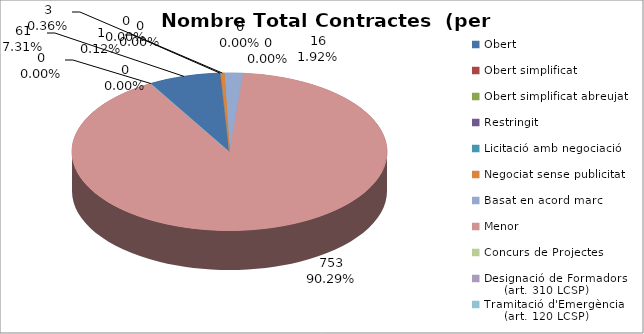
| Category | Nombre Total Contractes |
|---|---|
| Obert | 61 |
| Obert simplificat | 1 |
| Obert simplificat abreujat | 0 |
| Restringit | 0 |
| Licitació amb negociació | 0 |
| Negociat sense publicitat | 3 |
| Basat en acord marc | 16 |
| Menor | 753 |
| Concurs de Projectes | 0 |
| Designació de Formadors
     (art. 310 LCSP) | 0 |
| Tramitació d'Emergència
     (art. 120 LCSP) | 0 |